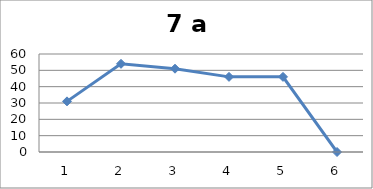
| Category | Series 0 |
|---|---|
| 0 | 31 |
| 1 | 54 |
| 2 | 51 |
| 3 | 46 |
| 4 | 46 |
| 5 | 0 |